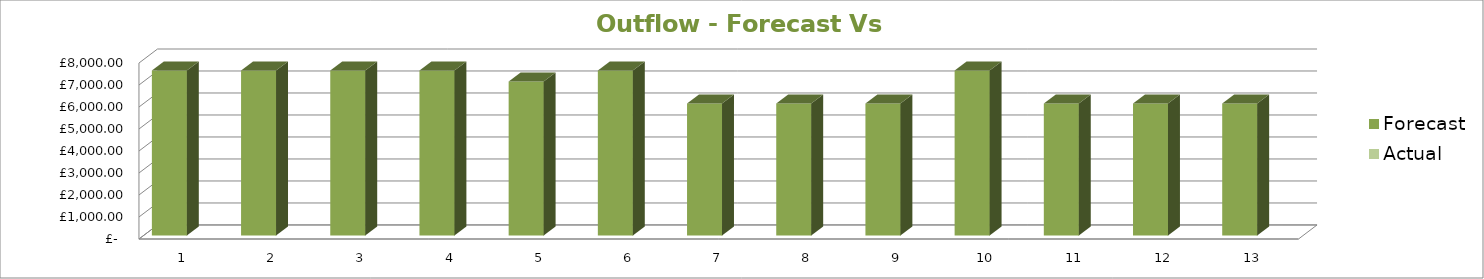
| Category | Forecast | Actual |
|---|---|---|
| 0 | 7500 |  |
| 1 | 7500 |  |
| 2 | 7500 |  |
| 3 | 7500 |  |
| 4 | 7000 |  |
| 5 | 7500 |  |
| 6 | 6000 |  |
| 7 | 6000 |  |
| 8 | 6000 |  |
| 9 | 7500 |  |
| 10 | 6000 |  |
| 11 | 6000 |  |
| 12 | 6000 |  |